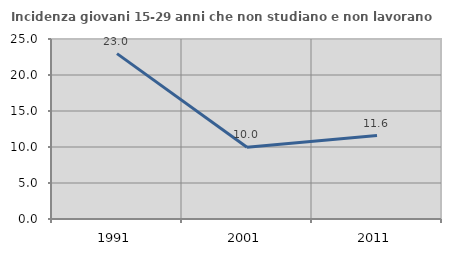
| Category | Incidenza giovani 15-29 anni che non studiano e non lavorano  |
|---|---|
| 1991.0 | 22.973 |
| 2001.0 | 9.968 |
| 2011.0 | 11.589 |